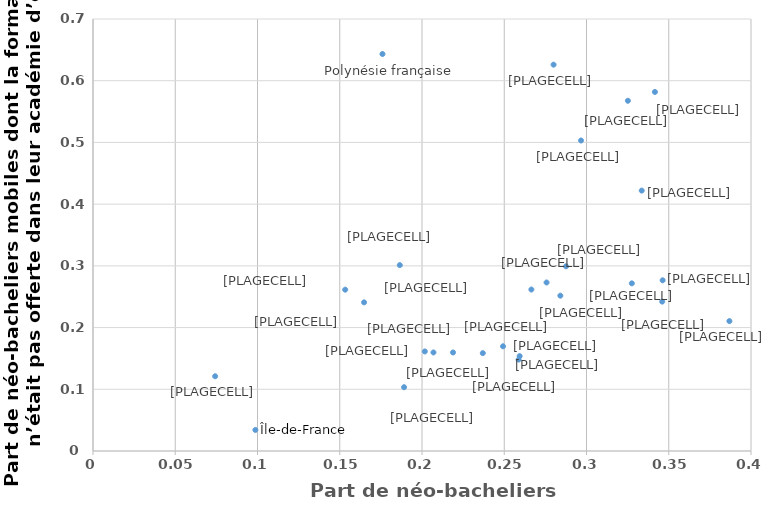
| Category | Series 0 |
|---|---|
| 0.2587419930694109 | 0.148 |
| 0.34602272727272726 | 0.242 |
| 0.28757721345229925 | 0.299 |
| 0.24924738376260333 | 0.17 |
| 0.26648546442921295 | 0.262 |
| 0.3415898617511521 | 0.582 |
| 0.3275579249538651 | 0.272 |
| 0.3868768838395548 | 0.21 |
| 0.29667721518987344 | 0.503 |
| 0.32515337423312884 | 0.567 |
| 0.09871309778071706 | 0.034 |
| 0.18649913771864993 | 0.301 |
| 0.07425443429424519 | 0.121 |
| 0.3335679099225897 | 0.422 |
| 0.18909987899097086 | 0.103 |
| 0.2799851466765689 | 0.626 |
| 0.6868852459016394 | 0.601 |
| 0.2593543235227013 | 0.154 |
| 0.15331917517298074 | 0.261 |
| 0.23696098562628337 | 0.159 |
| 0.27571637089959283 | 0.273 |
| 0.2069700269899143 | 0.16 |
| 0.3462822458270106 | 0.277 |
| 0.4343917058156488 | 0.219 |
| 0.1759656652360515 | 0.643 |
| 0.28410857347841684 | 0.252 |
| 0.2017116468245562 | 0.161 |
| 0.1647869134739561 | 0.241 |
| 0.21886716992451133 | 0.16 |